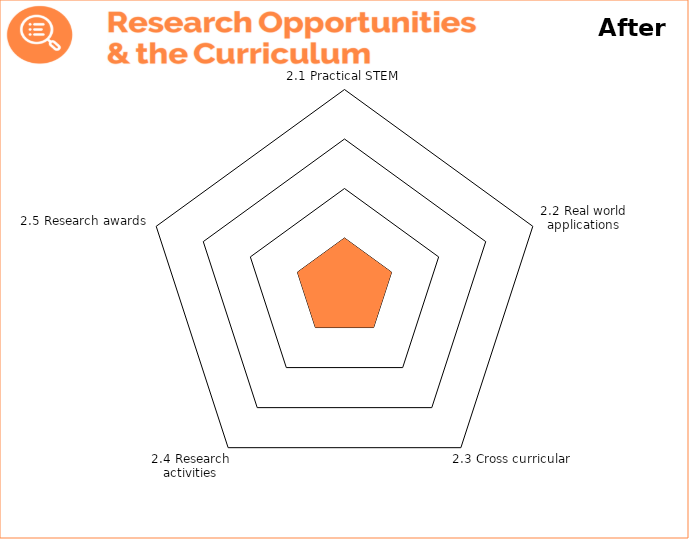
| Category | Theme 1: Leadership, Vision & Culture 

After |
|---|---|
| 2.1 Practical STEM | 1 |
| 2.2 Real world applications | 1 |
| 2.3 Cross curricular | 1 |
| 2.4 Research activities | 1 |
| 2.5 Research awards | 1 |